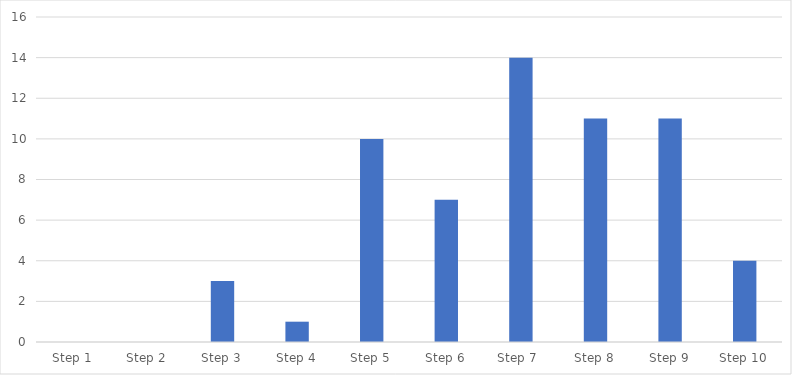
| Category | Number of Responses |
|---|---|
| Step 1 | 0 |
| Step 2 | 0 |
| Step 3 | 3 |
| Step 4 | 1 |
| Step 5 | 10 |
| Step 6 | 7 |
| Step 7  | 14 |
| Step 8 | 11 |
| Step 9 | 11 |
| Step 10 | 4 |